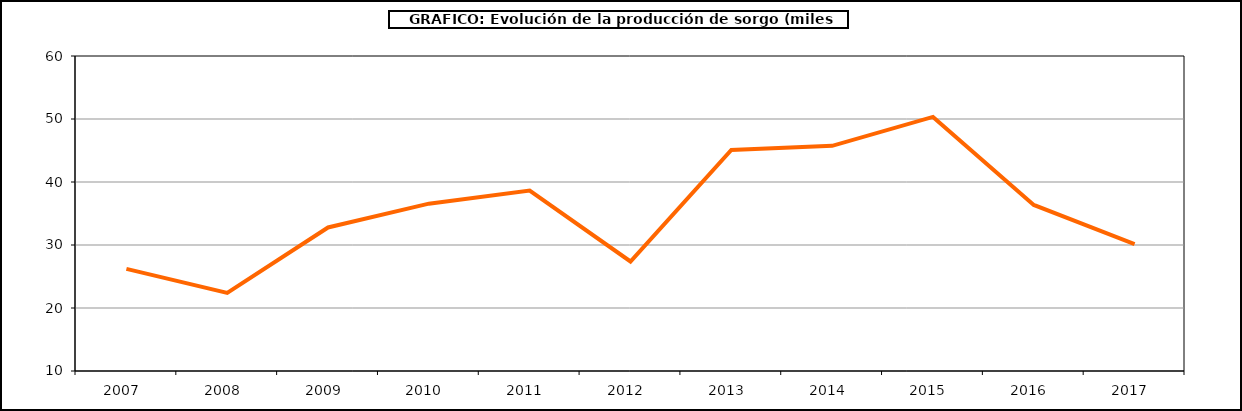
| Category | Producción |
|---|---|
| 2007.0 | 26.21 |
| 2008.0 | 22.397 |
| 2009.0 | 32.782 |
| 2010.0 | 36.561 |
| 2011.0 | 38.643 |
| 2012.0 | 27.38 |
| 2013.0 | 45.085 |
| 2014.0 | 45.744 |
| 2015.0 | 50.335 |
| 2016.0 | 36.361 |
| 2017.0 | 30.138 |